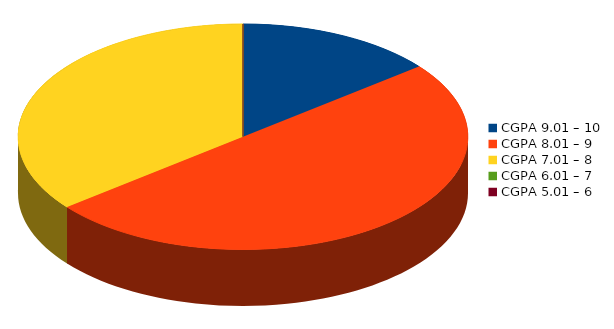
| Category | Number of students |
|---|---|
| CGPA 9.01 – 10 | 2 |
| CGPA 8.01 – 9 | 7 |
| CGPA 7.01 – 8 | 5 |
| CGPA 6.01 – 7 | 0 |
| CGPA 5.01 – 6 | 0 |